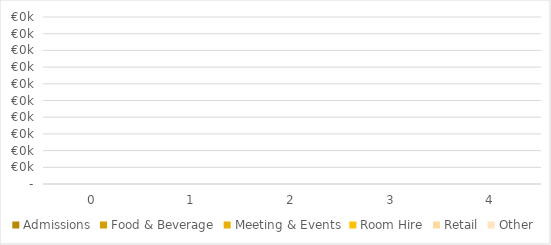
| Category | Admissions | Food & Beverage | Meeting & Events | Room Hire | Retail | Other |
|---|---|---|---|---|---|---|
| 0.0 | 0 | 0 | 0 | 0 | 0 | 0 |
| 1.0 | 0 | 0 | 0 | 0 | 0 | 0 |
| 2.0 | 0 | 0 | 0 | 0 | 0 | 0 |
| 3.0 | 0 | 0 | 0 | 0 | 0 | 0 |
| 4.0 | 0 | 0 | 0 | 0 | 0 | 0 |